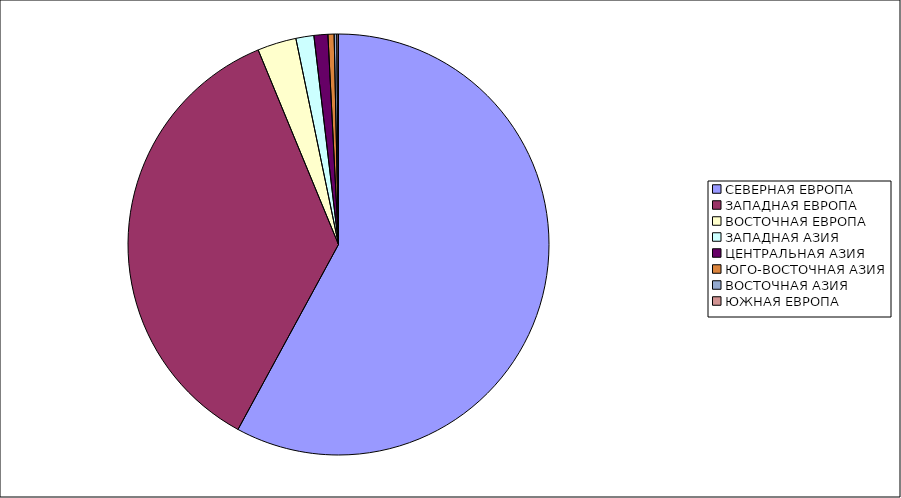
| Category | Оборот |
|---|---|
| СЕВЕРНАЯ ЕВРОПА | 57.922 |
| ЗАПАДНАЯ ЕВРОПА | 35.845 |
| ВОСТОЧНАЯ ЕВРОПА | 2.983 |
| ЗАПАДНАЯ АЗИЯ | 1.381 |
| ЦЕНТРАЛЬНАЯ АЗИЯ | 1.067 |
| ЮГО-ВОСТОЧНАЯ АЗИЯ | 0.471 |
| ВОСТОЧНАЯ АЗИЯ | 0.201 |
| ЮЖНАЯ ЕВРОПА | 0.13 |